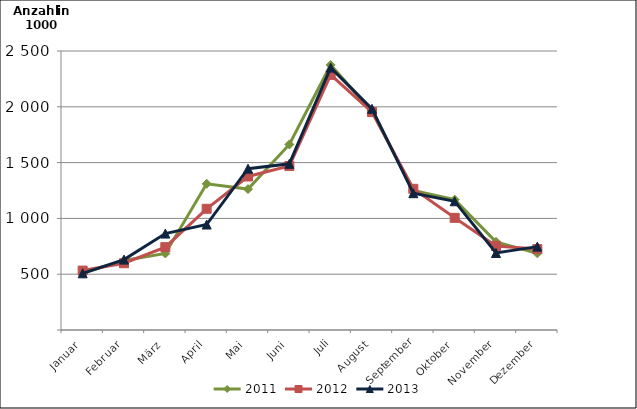
| Category | 2011 | 2012 | 2013 |
|---|---|---|---|
| Januar | 511.09 | 532.352 | 507.77 |
| Februar | 623.22 | 598.23 | 630.788 |
| März | 685.83 | 742.464 | 863.933 |
| April | 1310.423 | 1086.098 | 945.166 |
| Mai | 1262.692 | 1375.434 | 1445.61 |
| Juni | 1662.872 | 1468.927 | 1488.805 |
| Juli | 2374.665 | 2286.277 | 2351.148 |
| August | 1959.861 | 1952.851 | 1981.894 |
| September | 1250.99 | 1265.036 | 1225.757 |
| Oktober | 1168.309 | 1005.098 | 1153.634 |
| November | 789.998 | 753.447 | 690.221 |
| Dezember | 687.004 | 724.958 | 746.952 |